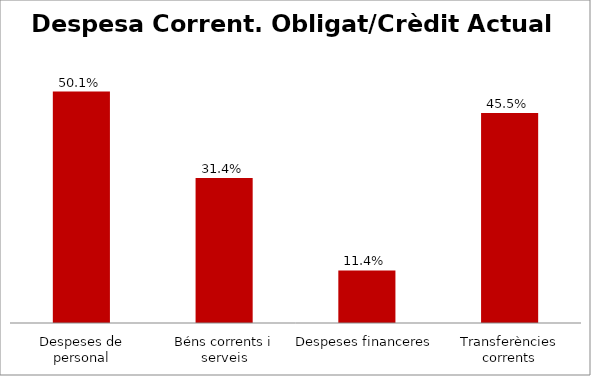
| Category | Series 0 |
|---|---|
| Despeses de personal | 0.501 |
| Béns corrents i serveis | 0.314 |
| Despeses financeres | 0.114 |
| Transferències corrents | 0.455 |